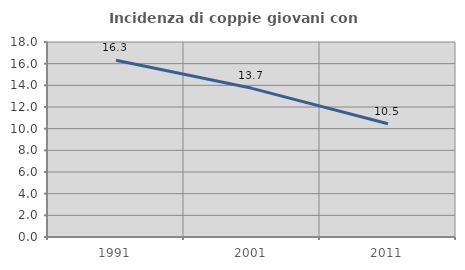
| Category | Incidenza di coppie giovani con figli |
|---|---|
| 1991.0 | 16.31 |
| 2001.0 | 13.723 |
| 2011.0 | 10.458 |